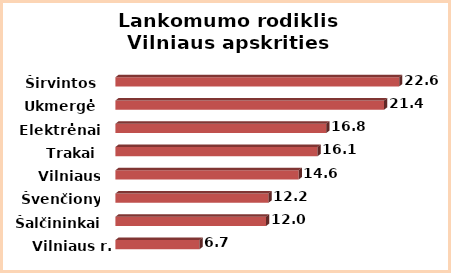
| Category | Series 0 |
|---|---|
| Vilniaus r. | 6.7 |
| Šalčininkai | 12 |
| Švenčionys | 12.2 |
| Vilniaus m. | 14.6 |
| Trakai | 16.1 |
| Elektrėnai | 16.8 |
| Ukmergė | 21.4 |
| Širvintos | 22.6 |